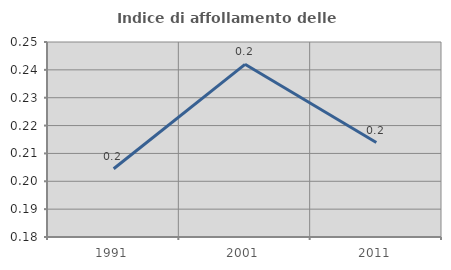
| Category | Indice di affollamento delle abitazioni  |
|---|---|
| 1991.0 | 0.204 |
| 2001.0 | 0.242 |
| 2011.0 | 0.214 |